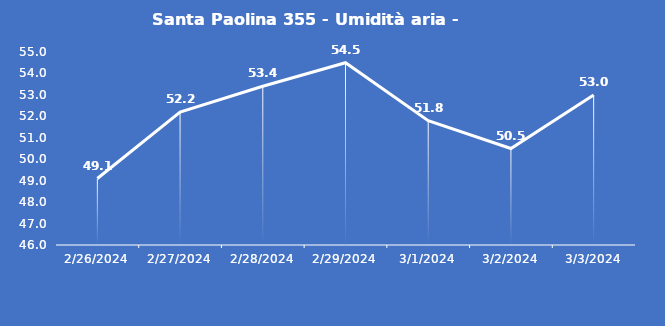
| Category | Santa Paolina 355 - Umidità aria - Grezzo (%) |
|---|---|
| 2/26/24 | 49.1 |
| 2/27/24 | 52.2 |
| 2/28/24 | 53.4 |
| 2/29/24 | 54.5 |
| 3/1/24 | 51.8 |
| 3/2/24 | 50.5 |
| 3/3/24 | 53 |